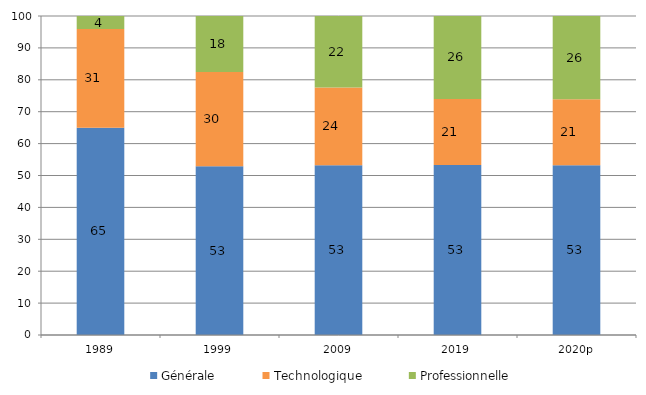
| Category | Générale | Technologique | Professionnelle |
|---|---|---|---|
| 1989 | 65.007 | 30.897 | 4.096 |
| 1999 | 52.867 | 29.602 | 17.53 |
| 2009 | 53.194 | 24.412 | 22.395 |
| 2019 | 53.324 | 20.691 | 25.986 |
| 2020p | 53.217 | 20.674 | 26.109 |